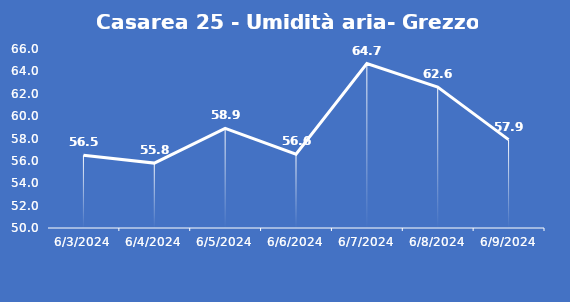
| Category | Casarea 25 - Umidità aria- Grezzo (%) |
|---|---|
| 6/3/24 | 56.5 |
| 6/4/24 | 55.8 |
| 6/5/24 | 58.9 |
| 6/6/24 | 56.6 |
| 6/7/24 | 64.7 |
| 6/8/24 | 62.6 |
| 6/9/24 | 57.9 |